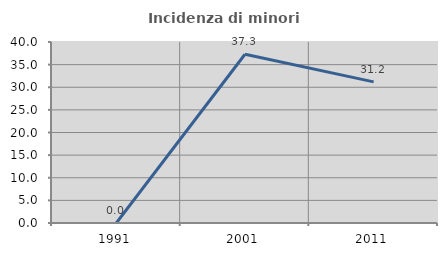
| Category | Incidenza di minori stranieri |
|---|---|
| 1991.0 | 0 |
| 2001.0 | 37.288 |
| 2011.0 | 31.193 |